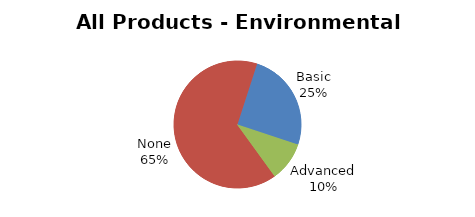
| Category | Series 0 |
|---|---|
| Basic | 1013993.1 |
| Advanced | 402339.51 |
| None | 2628636.64 |